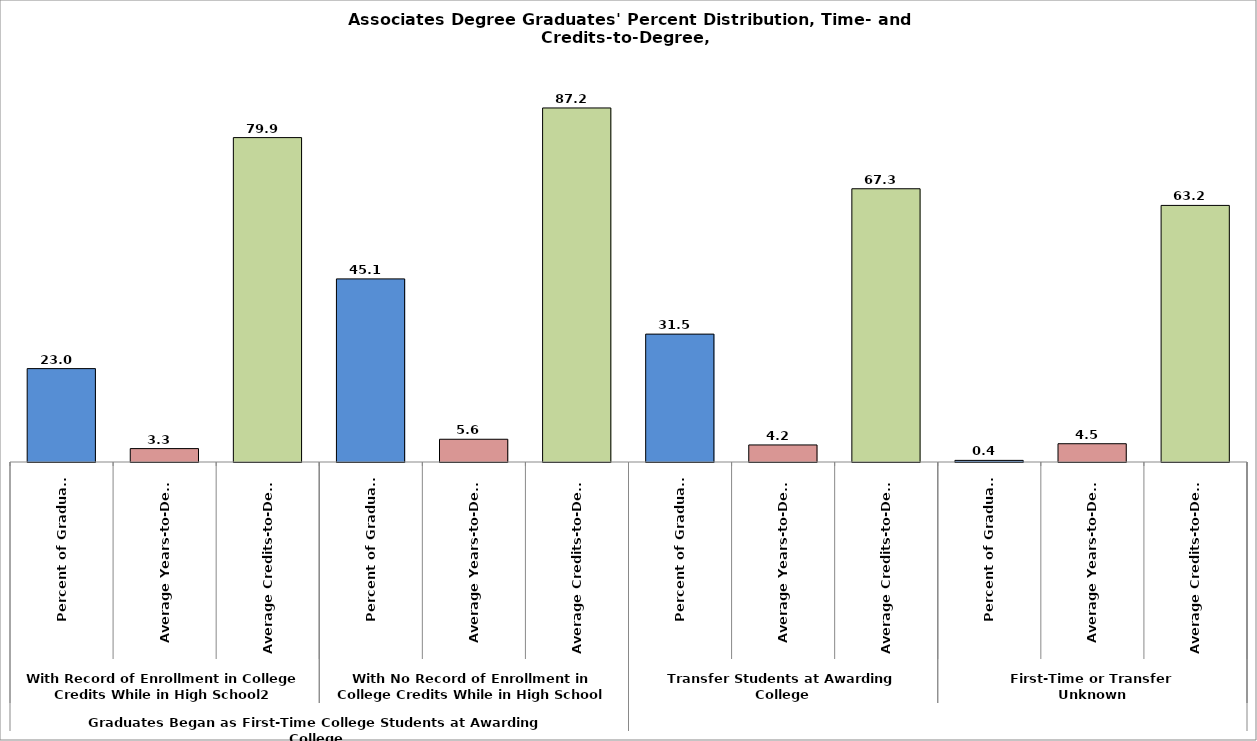
| Category | Series 10 |
|---|---|
| 0 | 23 |
| 1 | 3.3 |
| 2 | 79.9 |
| 3 | 45.1 |
| 4 | 5.6 |
| 5 | 87.2 |
| 6 | 31.5 |
| 7 | 4.2 |
| 8 | 67.3 |
| 9 | 0.4 |
| 10 | 4.5 |
| 11 | 63.2 |